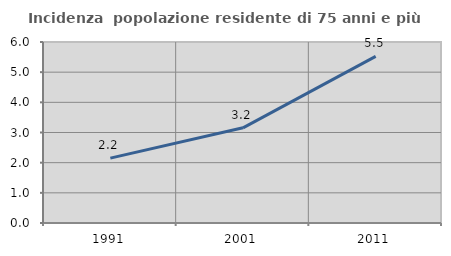
| Category | Incidenza  popolazione residente di 75 anni e più |
|---|---|
| 1991.0 | 2.151 |
| 2001.0 | 3.156 |
| 2011.0 | 5.524 |